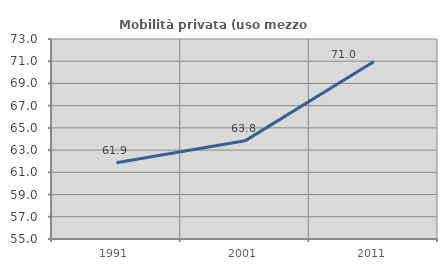
| Category | Mobilità privata (uso mezzo privato) |
|---|---|
| 1991.0 | 61.86 |
| 2001.0 | 63.834 |
| 2011.0 | 70.952 |